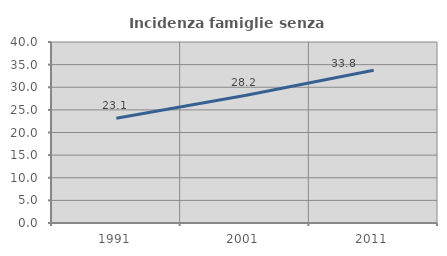
| Category | Incidenza famiglie senza nuclei |
|---|---|
| 1991.0 | 23.132 |
| 2001.0 | 28.194 |
| 2011.0 | 33.775 |